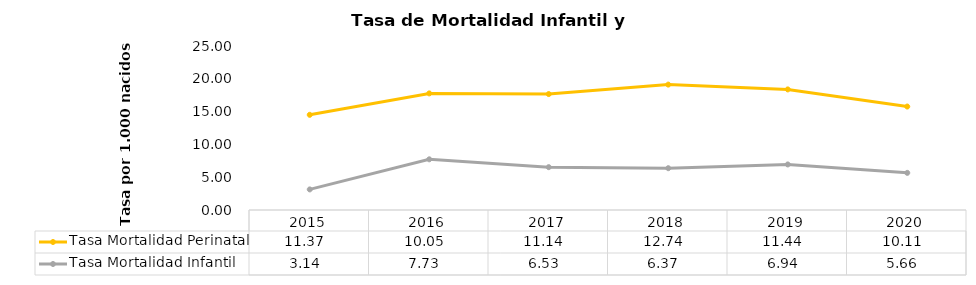
| Category | Tasa Mortalidad Infantil | Tasa Mortalidad Perinatal |
|---|---|---|
| 2015.0 | 3.137 | 11.373 |
| 2016.0 | 7.728 | 10.046 |
| 2017.0 | 6.531 | 11.141 |
| 2018.0 | 6.372 | 12.744 |
| 2019.0 | 6.944 | 11.438 |
| 2020.0 | 5.661 | 10.109 |